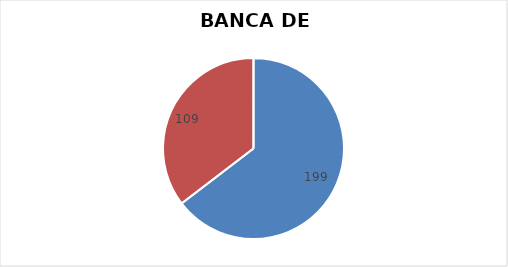
| Category | Series 0 |
|---|---|
| 0 | 199 |
| 1 | 109 |